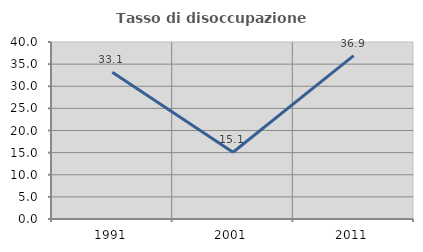
| Category | Tasso di disoccupazione giovanile  |
|---|---|
| 1991.0 | 33.149 |
| 2001.0 | 15.094 |
| 2011.0 | 36.923 |